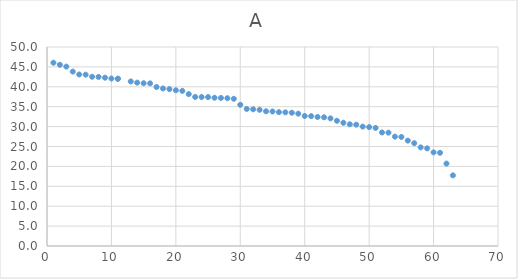
| Category | Series 0 |
|---|---|
| 7.0 | 42.52 |
| 5.0 | 43.1 |
| 3.0 | 45.08 |
| 4.0 | 43.82 |
| 1.0 | 46.05 |
| 15.0 | 40.9 |
| 8.0 | 42.48 |
| 10.0 | 42.08 |
| 2.0 | 45.53 |
| 14.0 | 41.05 |
| 11.0 | 42.02 |
| 18.0 | 39.58 |
| 9.0 | 42.29 |
| 6.0 | 43.05 |
| 19.0 | 39.42 |
| 13.0 | 41.35 |
| 11.0 | 42.02 |
| 16.0 | 40.87 |
| 28.0 | 37.13 |
| 30.0 | 35.48 |
| 22.0 | 38.17 |
| 21.0 | 38.97 |
| 20.0 | 39.13 |
| 29.0 | 36.98 |
| 26.0 | 37.25 |
| 23.0 | 37.45 |
| 25.0 | 37.41 |
| 27.0 | 37.2 |
| 17.0 | 39.95 |
| 35.0 | 33.8 |
| 31.0 | 34.44 |
| 36.0 | 33.63 |
| 40.0 | 32.67 |
| 52.0 | 28.53 |
| 38.0 | 33.48 |
| 33.0 | 34.22 |
| 46.0 | 30.96 |
| 24.0 | 37.42 |
| 42.0 | 32.42 |
| 43.0 | 32.34 |
| 39.0 | 33.25 |
| 44.0 | 32.07 |
| 37.0 | 33.58 |
| 41.0 | 32.63 |
| 49.0 | 30 |
| 53.0 | 28.49 |
| 32.0 | 34.35 |
| 34.0 | 33.85 |
| 54.0 | 27.48 |
| 56.0 | 26.48 |
| 50.0 | 29.88 |
| 45.0 | 31.46 |
| 48.0 | 30.49 |
| 61.0 | 23.42 |
| 47.0 | 30.58 |
| 55.0 | 27.4 |
| 58.0 | 24.78 |
| 51.0 | 29.67 |
| 60.0 | 23.53 |
| 57.0 | 25.84 |
| 62.0 | 20.71 |
| 63.0 | 17.75 |
| 59.0 | 24.53 |